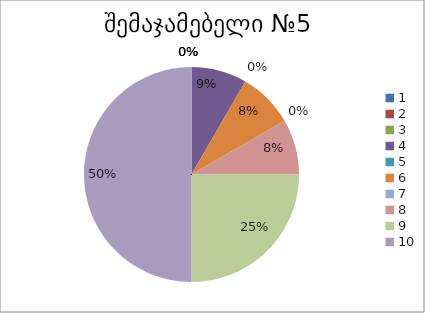
| Category | რაოდენობა | ქულა |
|---|---|---|
| 0 | 0 | 1 |
| 1 | 0 | 2 |
| 2 | 0 | 3 |
| 3 | 1 | 4 |
| 4 | 0 | 5 |
| 5 | 1 | 6 |
| 6 | 0 | 7 |
| 7 | 1 | 8 |
| 8 | 3 | 9 |
| 9 | 6 | 10 |